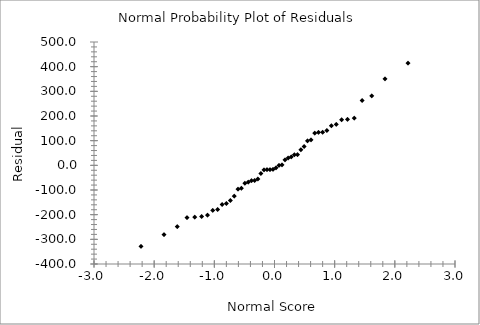
| Category | Series 0 |
|---|---|
| -2.2189508835295726 | -328.162 |
| -1.8368965712997025 | -280.966 |
| -1.6166203108543593 | -248.399 |
| -1.4549057193893216 | -211.909 |
| -1.324218574982646 | -210.145 |
| -1.2129065191275465 | -207.435 |
| -1.11488276734327 | -201.807 |
| -1.0265428818120417 | -182.819 |
| -0.9455642985352888 | -178.896 |
| -0.8703558609545241 | -158.533 |
| -0.7997751906771557 | -154.292 |
| -0.7329709314251283 | -142.492 |
| -0.6692888182099168 | -125.068 |
| -0.608212782873522 | -96.525 |
| -0.5493264235281139 | -92.856 |
| -0.49228687636440505 | -72.517 |
| -0.4368065400187663 | -68.313 |
| -0.38263993612062697 | -62.296 |
| -0.32957402197565067 | -61.737 |
| -0.2774208761163559 | -55.492 |
| -0.22601204392906715 | -33.256 |
| -0.17519405906795282 | -18.088 |
| -0.12482480218232869 | -16.966 |
| -0.07477045310977706 | -16.909 |
| -0.024902854560931255 | -16.794 |
| 0.024902854560931255 | -10.472 |
| 0.07477045310977706 | -0.656 |
| 0.12482480218232869 | 1.969 |
| 0.17519405906795255 | 21.977 |
| 0.22601204392906693 | 29.879 |
| 0.2774208761163557 | 34.042 |
| 0.32957402197565033 | 42.846 |
| 0.3826399361206265 | 43.638 |
| 0.4368065400187662 | 63.099 |
| 0.4922868763644046 | 76.675 |
| 0.5493264235281137 | 99.434 |
| 0.6082127828735215 | 103.291 |
| 0.6692888182099168 | 130.577 |
| 0.7329709314251283 | 133.589 |
| 0.7997751906771557 | 134.136 |
| 0.8703558609545241 | 140.989 |
| 0.9455642985352881 | 160.806 |
| 1.0265428818120417 | 165.887 |
| 1.114882767343269 | 184.552 |
| 1.2129065191275465 | 186.271 |
| 1.3242185749826452 | 191.259 |
| 1.4549057193893207 | 262.752 |
| 1.616620310854358 | 281.259 |
| 1.8368965712997025 | 350.806 |
| 2.2189508835295726 | 414.067 |